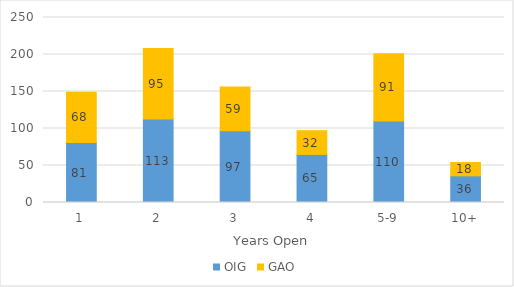
| Category | OIG | GAO |
|---|---|---|
| 1 | 81 | 68 |
| 2 | 113 | 95 |
| 3 | 97 | 59 |
| 4 | 65 | 32 |
| 5-9 | 110 | 91 |
| 10+ | 36 | 18 |